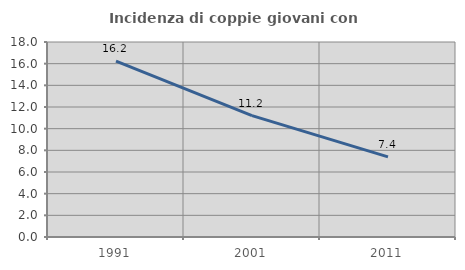
| Category | Incidenza di coppie giovani con figli |
|---|---|
| 1991.0 | 16.237 |
| 2001.0 | 11.199 |
| 2011.0 | 7.395 |